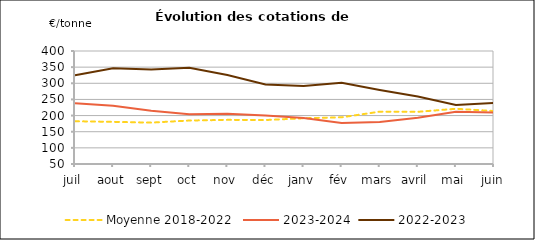
| Category | Moyenne 2018-2022 | 2023-2024 | 2022-2023 |
|---|---|---|---|
| juil | 182.484 | 238.38 | 325.08 |
| aout | 180.556 | 230.25 | 346.69 |
| sept | 178.187 | 214.74 | 342.84 |
| oct | 184.641 | 204.21 | 348.44 |
| nov | 186.706 | 205.45 | 325.9 |
| déc | 186.2 | 200.19 | 296.52 |
| janv | 191.664 | 192.21 | 291.84 |
| fév | 194.65 | 177.34 | 301.8 |
| mars | 212.078 | 180.24 | 279.04 |
| avril | 211.634 | 193.27 | 258.83 |
| mai | 221.011 | 211.99 | 232.87 |
| juin | 214.105 | 209.28 | 239.06 |